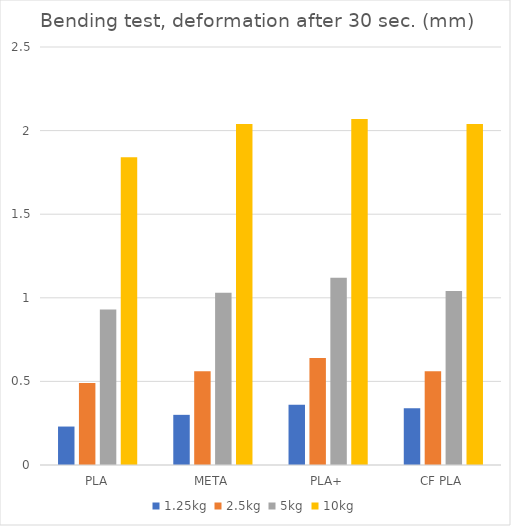
| Category | 1.25kg | 2.5kg | 5kg | 10kg |
|---|---|---|---|---|
| PLA | 0.23 | 0.49 | 0.93 | 1.84 |
| META | 0.3 | 0.56 | 1.03 | 2.04 |
| PLA+ | 0.36 | 0.64 | 1.12 | 2.07 |
| CF PLA | 0.34 | 0.56 | 1.04 | 2.04 |